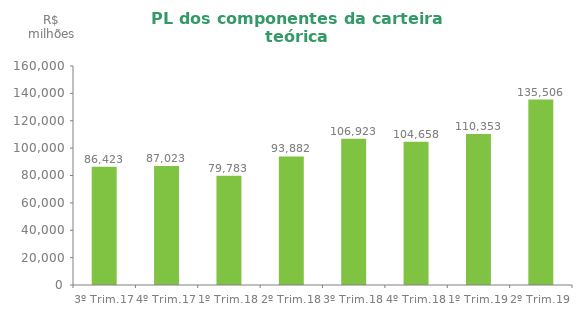
| Category | Series 0 |
|---|---|
| 3º Trim.17 | 86422.542 |
| 4º Trim.17 | 87022.625 |
| 1º Trim.18 | 79783.188 |
| 2º Trim.18 | 93882.016 |
| 3º Trim.18 | 106923.21 |
| 4º Trim.18 | 104658.138 |
| 1º Trim.19 | 110353.048 |
| 2º Trim.19 | 135505.78 |